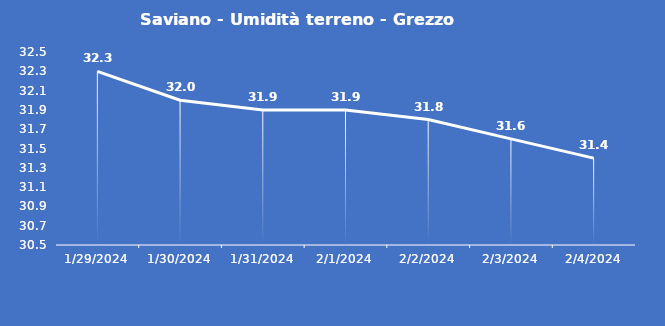
| Category | Saviano - Umidità terreno - Grezzo (%VWC) |
|---|---|
| 1/29/24 | 32.3 |
| 1/30/24 | 32 |
| 1/31/24 | 31.9 |
| 2/1/24 | 31.9 |
| 2/2/24 | 31.8 |
| 2/3/24 | 31.6 |
| 2/4/24 | 31.4 |